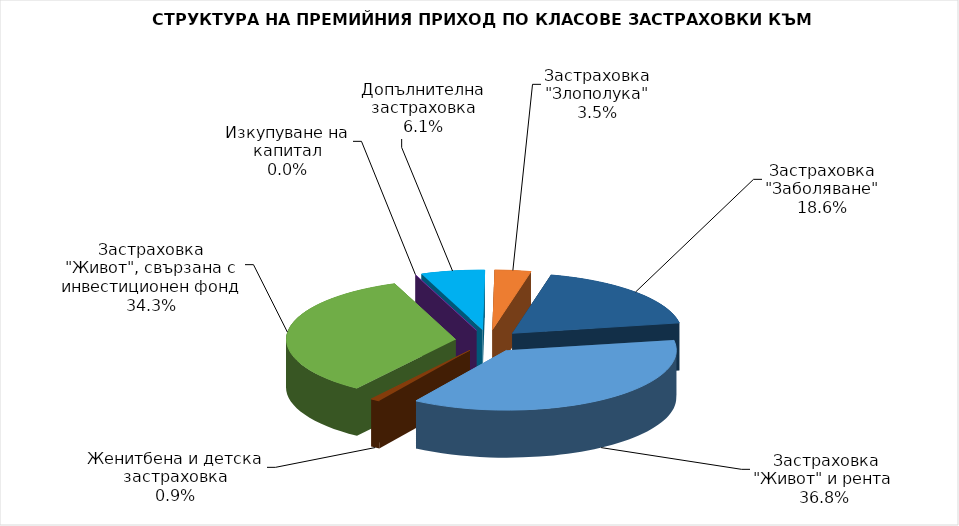
| Category |  Застраховка "Живот" и рента |
|---|---|
|  Застраховка "Живот" и рента | 64490605.811 |
| Женитбена и детска застраховка | 1584259.935 |
| Застраховка "Живот", свързана с инвестиционен фонд | 60138871.437 |
| Изкупуване на капитал | 0 |
| Допълнителна застраховка | 10641032.021 |
| Застраховка "Злополука" | 6058141.04 |
| Застраховка "Заболяване" | 32571334.94 |